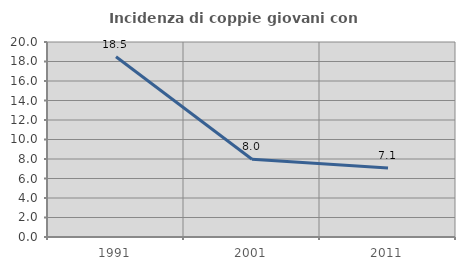
| Category | Incidenza di coppie giovani con figli |
|---|---|
| 1991.0 | 18.493 |
| 2001.0 | 7.971 |
| 2011.0 | 7.087 |